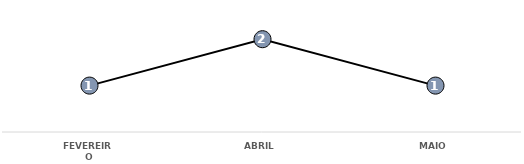
| Category | Total |
|---|---|
| FEVEREIRO | 1 |
| ABRIL | 2 |
| MAIO | 1 |